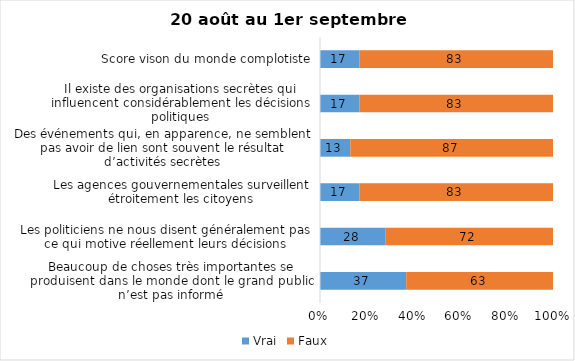
| Category | Vrai | Faux |
|---|---|---|
| Beaucoup de choses très importantes se produisent dans le monde dont le grand public n’est pas informé | 37 | 63 |
| Les politiciens ne nous disent généralement pas ce qui motive réellement leurs décisions | 28 | 72 |
| Les agences gouvernementales surveillent étroitement les citoyens | 17 | 83 |
| Des événements qui, en apparence, ne semblent pas avoir de lien sont souvent le résultat d’activités secrètes | 13 | 87 |
| Il existe des organisations secrètes qui influencent considérablement les décisions politiques | 17 | 83 |
| Score vison du monde complotiste | 17 | 83 |